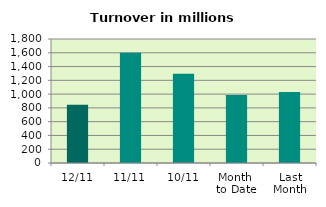
| Category | Series 0 |
|---|---|
| 12/11 | 844.155 |
| 11/11 | 1599.22 |
| 10/11 | 1296.198 |
| Month 
to Date | 987.005 |
| Last
Month | 1032.218 |